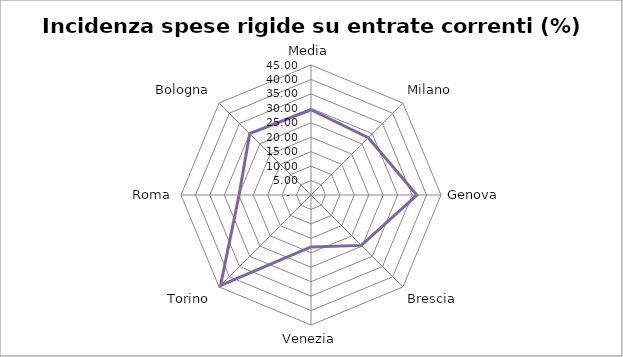
| Category | Incidenza spese rigide su entrate correnti |
|---|---|
| Media | 29.503 |
| Milano | 28.03 |
| Genova | 36.66 |
| Brescia | 24.66 |
| Venezia | 17.98 |
| Torino | 44.28 |
| Roma | 24.9 |
| Bologna | 30.01 |